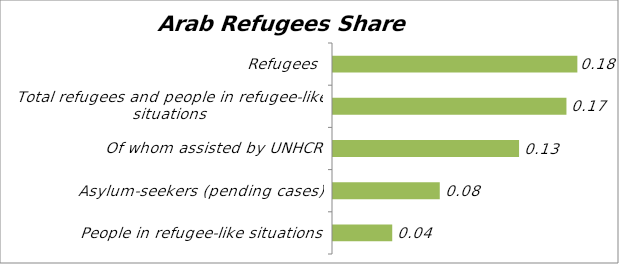
| Category | Arab refugees share (%) |
|---|---|
| People in refugee-like situations | 0.043 |
| Asylum-seekers (pending cases) | 0.077 |
| Of whom assisted by UNHCR | 0.134 |
| Total refugees and people in refugee-like situations | 0.169 |
| Refugees | 0.176 |